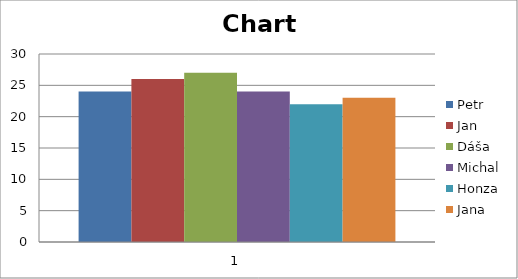
| Category | Petr | Jan | Dáša | Michal | Honza | Jana |
|---|---|---|---|---|---|---|
| 0 | 24 | 26 | 27 | 24 | 22 | 23 |